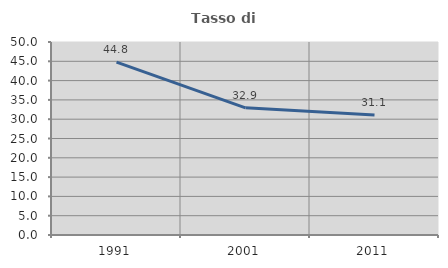
| Category | Tasso di occupazione   |
|---|---|
| 1991.0 | 44.777 |
| 2001.0 | 32.945 |
| 2011.0 | 31.058 |